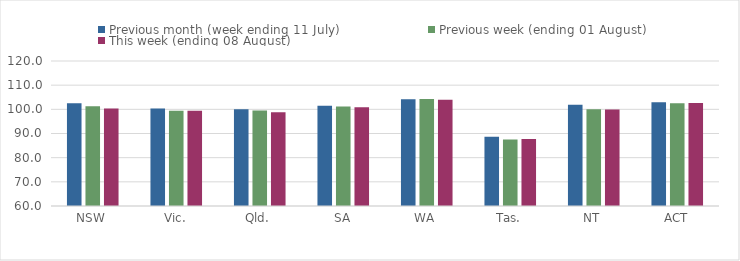
| Category | Previous month (week ending 11 July) | Previous week (ending 01 August) | This week (ending 08 August) |
|---|---|---|---|
| NSW | 102.546 | 101.25 | 100.364 |
| Vic. | 100.314 | 99.412 | 99.439 |
| Qld. | 100.044 | 99.488 | 98.837 |
| SA | 101.496 | 101.218 | 100.888 |
| WA | 104.143 | 104.279 | 103.993 |
| Tas. | 88.64 | 87.518 | 87.694 |
| NT | 101.852 | 100 | 99.922 |
| ACT | 102.902 | 102.539 | 102.617 |